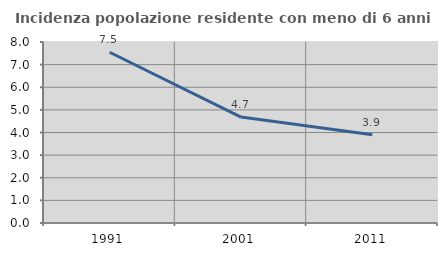
| Category | Incidenza popolazione residente con meno di 6 anni |
|---|---|
| 1991.0 | 7.547 |
| 2001.0 | 4.682 |
| 2011.0 | 3.898 |